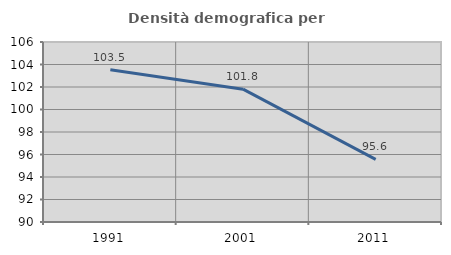
| Category | Densità demografica |
|---|---|
| 1991.0 | 103.531 |
| 2001.0 | 101.81 |
| 2011.0 | 95.567 |